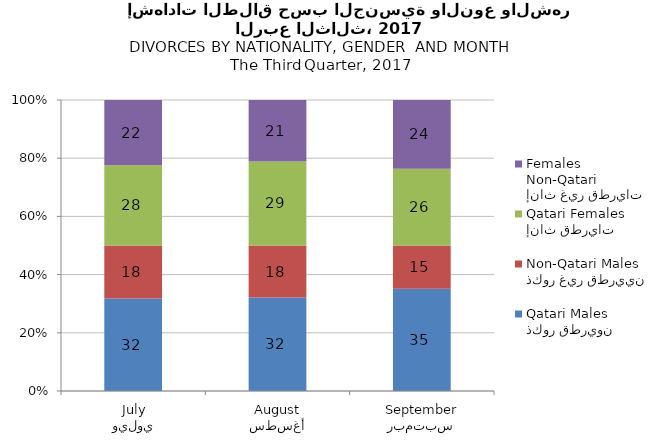
| Category | ذكور قطريون
Qatari Males | ذكور غير قطريين
Non-Qatari Males | إناث قطريات
Qatari Females | إناث غير قطريات
Non-Qatari Females |
|---|---|---|---|---|
| يوليو
July | 31.78 | 18.22 | 27.542 | 22.458 |
| أغسطس
August | 32.11 | 17.89 | 28.899 | 21.101 |
| سبتمبر
September | 35.135 | 14.865 | 26.351 | 23.649 |